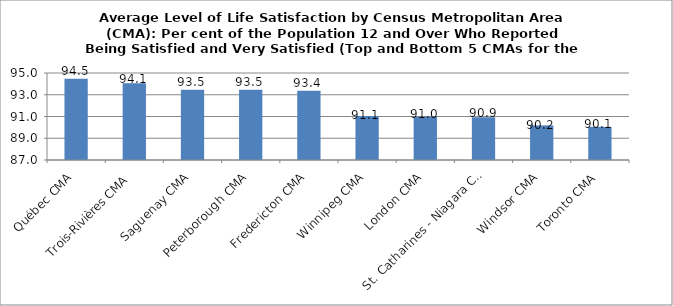
| Category | Québec CMA Trois-Rivières CMA Saguenay CMA Peterborough CMA Fredericton CMA |
|---|---|
| Québec CMA | 94.463 |
| Trois-Rivières CMA | 94.067 |
| Saguenay CMA | 93.467 |
| Peterborough CMA | 93.45 |
| Fredericton CMA | 93.367 |
| Winnipeg CMA | 91.05 |
| London CMA | 90.983 |
| St. Catharines - Niagara CMA | 90.933 |
| Windsor CMA | 90.183 |
| Toronto CMA | 90.05 |